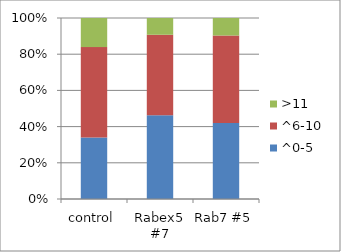
| Category | ^0-5 | ^6-10 | >11 |
|---|---|---|---|
| control | 33.929 | 50 | 16.071 |
| Rabex5 #7 | 46.296 | 44.444 | 9.259 |
| Rab7 #5 | 41.935 | 48.387 | 9.677 |